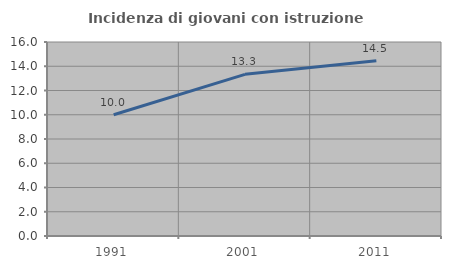
| Category | Incidenza di giovani con istruzione universitaria |
|---|---|
| 1991.0 | 10 |
| 2001.0 | 13.333 |
| 2011.0 | 14.458 |